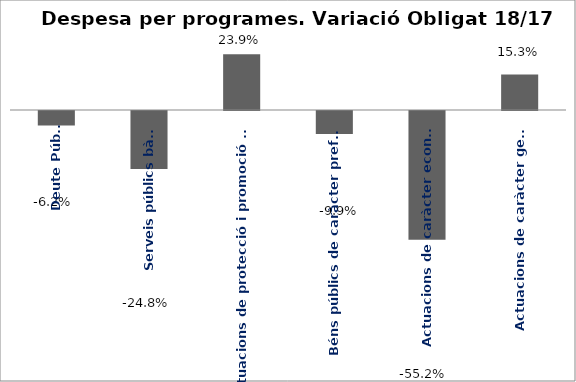
| Category | Series 0 |
|---|---|
| Deute Públic | -0.062 |
| Serveis públics bàsics | -0.248 |
| Actuacions de protecció i promoció social | 0.239 |
| Béns públics de caràcter preferent | -0.099 |
| Actuacions de caràcter econòmic | -0.552 |
| Actuacions de caràcter general | 0.153 |